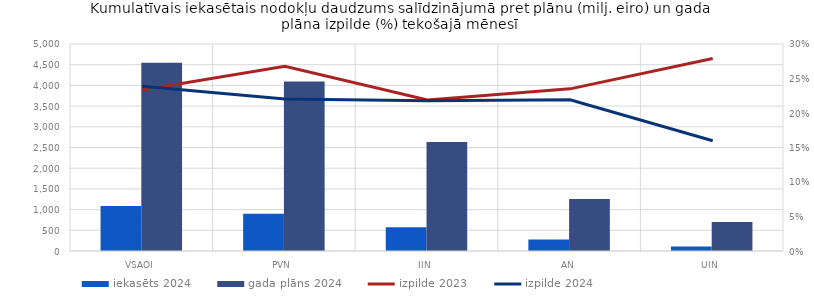
| Category | iekasēts 2024 | gada plāns 2024 |
|---|---|---|
| VSAOI | 1085.646 | 4544.733 |
| PVN | 901.764 | 4096.678 |
| IIN | 574.043 | 2634.714 |
| AN | 275.089 | 1254.984 |
| UIN | 111.51 | 697.842 |